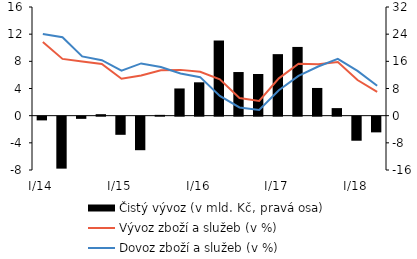
| Category | Čistý vývoz (v mld. Kč, pravá osa) |
|---|---|
| I/14 | -1.098 |
| II | -15.303 |
| III | -0.647 |
| IV | 0.436 |
| I/15 | -5.344 |
| II | -9.876 |
| III | 0.239 |
| IV | 8.012 |
| I/16 | 9.823 |
| II | 22.132 |
| III | 12.849 |
| IV | 12.276 |
| I/17 | 18.117 |
| II | 20.241 |
| III | 8.158 |
| IV | 2.227 |
| I/18 | -7.087 |
| II | -4.623 |